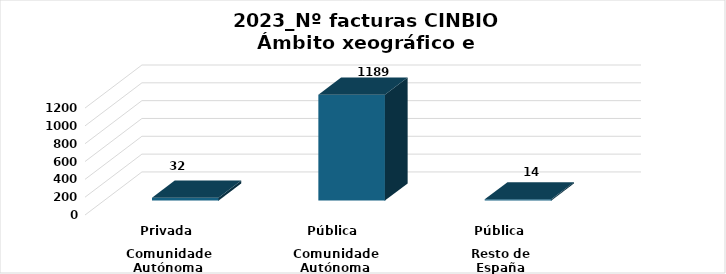
| Category | Series 0 |
|---|---|
| 0 | 32 |
| 1 | 1189 |
| 2 | 14 |